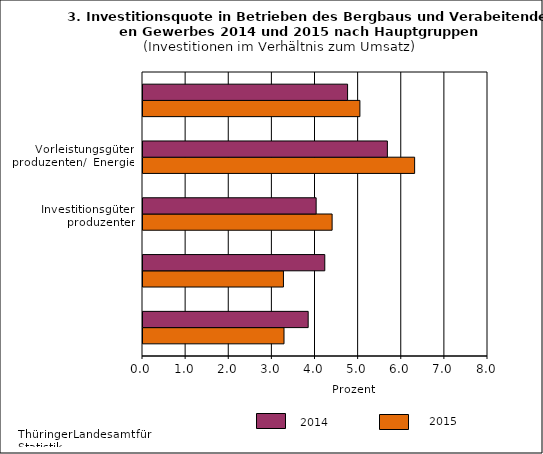
| Category | BJ | VJ |
|---|---|---|
| 0 | 3.27 | 3.83 |
| 1 | 3.257 | 4.215 |
| 2 | 4.385 | 4.015 |
| 3 | 6.299 | 5.667 |
| 4 | 5.029 | 4.744 |